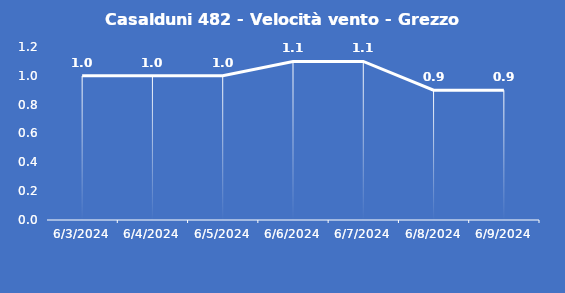
| Category | Casalduni 482 - Velocità vento - Grezzo (m/s) |
|---|---|
| 6/3/24 | 1 |
| 6/4/24 | 1 |
| 6/5/24 | 1 |
| 6/6/24 | 1.1 |
| 6/7/24 | 1.1 |
| 6/8/24 | 0.9 |
| 6/9/24 | 0.9 |